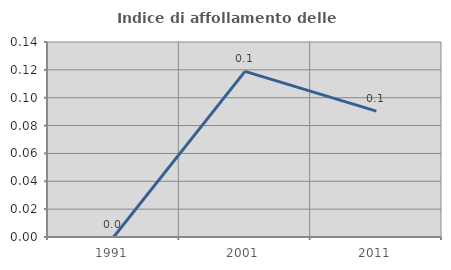
| Category | Indice di affollamento delle abitazioni  |
|---|---|
| 1991.0 | 0 |
| 2001.0 | 0.119 |
| 2011.0 | 0.09 |